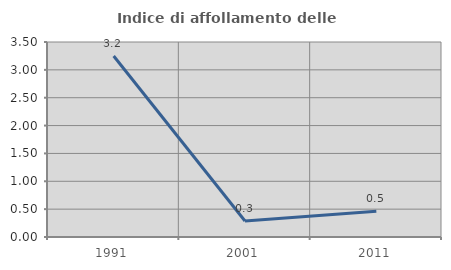
| Category | Indice di affollamento delle abitazioni  |
|---|---|
| 1991.0 | 3.248 |
| 2001.0 | 0.288 |
| 2011.0 | 0.463 |